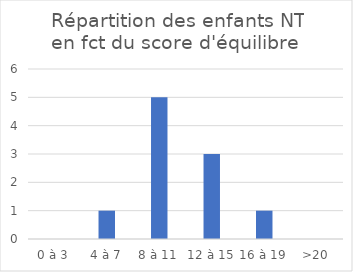
| Category | Series 0 |
|---|---|
| 0 à 3 | 0 |
| 4 à 7 | 1 |
| 8 à 11 | 5 |
| 12 à 15 | 3 |
| 16 à 19 | 1 |
| >20 | 0 |